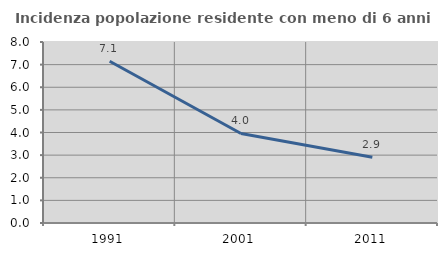
| Category | Incidenza popolazione residente con meno di 6 anni |
|---|---|
| 1991.0 | 7.147 |
| 2001.0 | 3.958 |
| 2011.0 | 2.904 |